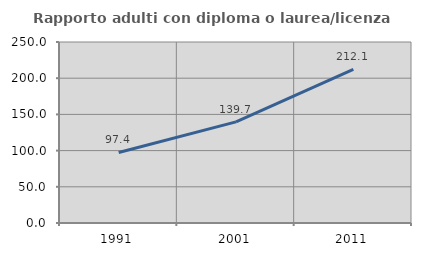
| Category | Rapporto adulti con diploma o laurea/licenza media  |
|---|---|
| 1991.0 | 97.436 |
| 2001.0 | 139.651 |
| 2011.0 | 212.114 |